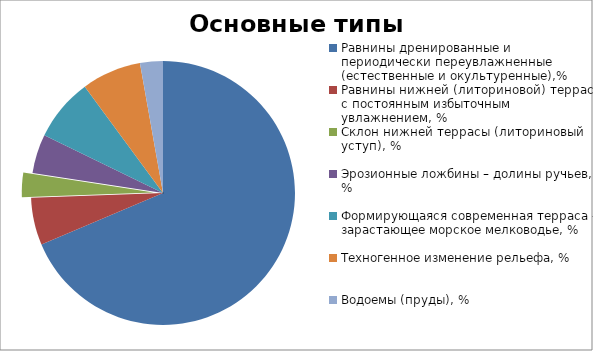
| Category | Series 0 |
|---|---|
| Равнины дренированные и периодически переувлажненные (естественные и окультуренные),% | 68.7 |
| Равнины нижней (литориновой) террасы с постоянным избыточным увлажнением, % | 5.8 |
| Склон нижней террасы (литориновый уступ), % | 3 |
| Эрозионные ложбины – долины ручьев, % | 4.8 |
| Формирующаяся современная терраса – зарастающее морское мелководье, % | 7.7 |
| Техногенное изменение рельефа, % | 7.3 |
| Водоемы (пруды), % | 2.8 |